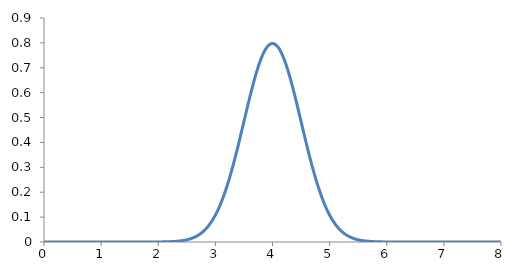
| Category | Series 0 |
|---|---|
| 0.0 | 0 |
| 0.1 | 0 |
| 0.2 | 0 |
| 0.3 | 0 |
| 0.4 | 0 |
| 0.5 | 0 |
| 0.6 | 0 |
| 0.7 | 0 |
| 0.8 | 0 |
| 0.9 | 0 |
| 1.0 | 0 |
| 1.1 | 0 |
| 1.2 | 0 |
| 1.3 | 0 |
| 1.4 | 0 |
| 1.5 | 0 |
| 1.6 | 0 |
| 1.7 | 0 |
| 1.8 | 0 |
| 1.9 | 0 |
| 2.0 | 0 |
| 2.1 | 0.001 |
| 2.2 | 0.001 |
| 2.3 | 0.002 |
| 2.4 | 0.005 |
| 2.5 | 0.009 |
| 2.6 | 0.016 |
| 2.7 | 0.027 |
| 2.8 | 0.045 |
| 2.9 | 0.071 |
| 3.0 | 0.108 |
| 3.1 | 0.158 |
| 3.2 | 0.222 |
| 3.3 | 0.299 |
| 3.4 | 0.388 |
| 3.5 | 0.484 |
| 3.6 | 0.579 |
| 3.7 | 0.666 |
| 3.8 | 0.737 |
| 3.9 | 0.782 |
| 4.0 | 0.798 |
| 4.1 | 0.782 |
| 4.2 | 0.737 |
| 4.3 | 0.666 |
| 4.4 | 0.579 |
| 4.5 | 0.484 |
| 4.6 | 0.388 |
| 4.7 | 0.299 |
| 4.8 | 0.222 |
| 4.9 | 0.158 |
| 5.0 | 0.108 |
| 5.1 | 0.071 |
| 5.2 | 0.045 |
| 5.3 | 0.027 |
| 5.4 | 0.016 |
| 5.5 | 0.009 |
| 5.6 | 0.005 |
| 5.7 | 0.002 |
| 5.8 | 0.001 |
| 5.9 | 0.001 |
| 6.0 | 0 |
| 6.1 | 0 |
| 6.2 | 0 |
| 6.3 | 0 |
| 6.4 | 0 |
| 6.5 | 0 |
| 6.6 | 0 |
| 6.7 | 0 |
| 6.8 | 0 |
| 6.9 | 0 |
| 7.0 | 0 |
| 7.1 | 0 |
| 7.2 | 0 |
| 7.3 | 0 |
| 7.4 | 0 |
| 7.5 | 0 |
| 7.6 | 0 |
| 7.7 | 0 |
| 7.8 | 0 |
| 7.9 | 0 |
| 8.0 | 0 |